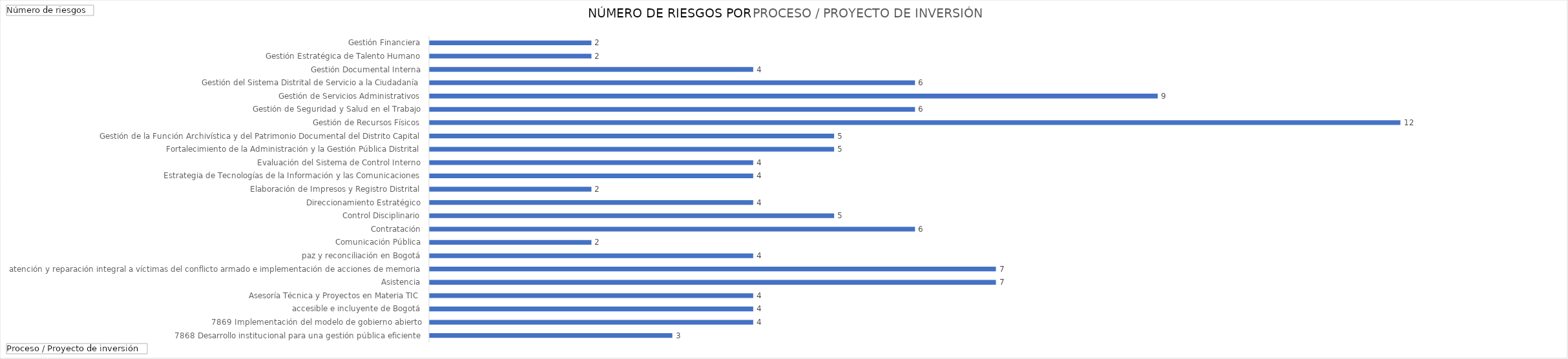
| Category | Total |
|---|---|
| 7868 Desarrollo institucional para una gestión pública eficiente | 3 |
| 7869 Implementación del modelo de gobierno abierto, accesible e incluyente de Bogotá | 4 |
| Asesoría Técnica y Proyectos en Materia TIC | 4 |
| Asistencia, atención y reparación integral a víctimas del conflicto armado e implementación de acciones de memoria, paz y reconciliación en Bogotá | 4 |
| Comunicación Pública | 7 |
| Contratación | 7 |
| Control Disciplinario | 4 |
| Direccionamiento Estratégico | 2 |
| Elaboración de Impresos y Registro Distrital | 6 |
| Estrategia de Tecnologías de la Información y las Comunicaciones | 5 |
| Evaluación del Sistema de Control Interno | 4 |
| Fortalecimiento de la Administración y la Gestión Pública Distrital | 2 |
| Gestión de la Función Archivística y del Patrimonio Documental del Distrito Capital | 4 |
| Gestión de Recursos Físicos | 4 |
| Gestión de Seguridad y Salud en el Trabajo | 5 |
| Gestión de Servicios Administrativos | 5 |
| Gestión del Sistema Distrital de Servicio a la Ciudadanía | 12 |
| Gestión Documental Interna | 6 |
| Gestión Estratégica de Talento Humano | 9 |
| Gestión Financiera | 6 |
| Gestión Jurídica | 4 |
| Gestión, Administración y Soporte de infraestructura y Recursos tecnológicos | 2 |
| Internacionalización de Bogotá | 2 |